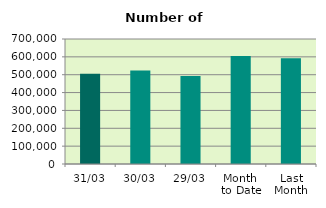
| Category | Series 0 |
|---|---|
| 31/03 | 505604 |
| 30/03 | 523774 |
| 29/03 | 492348 |
| Month 
to Date | 605064 |
| Last
Month | 592303 |